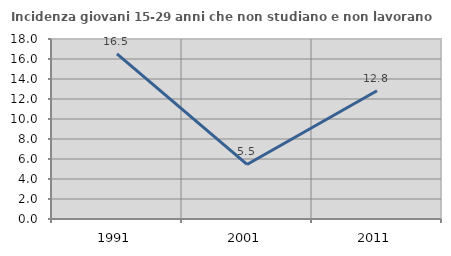
| Category | Incidenza giovani 15-29 anni che non studiano e non lavorano  |
|---|---|
| 1991.0 | 16.505 |
| 2001.0 | 5.455 |
| 2011.0 | 12.821 |